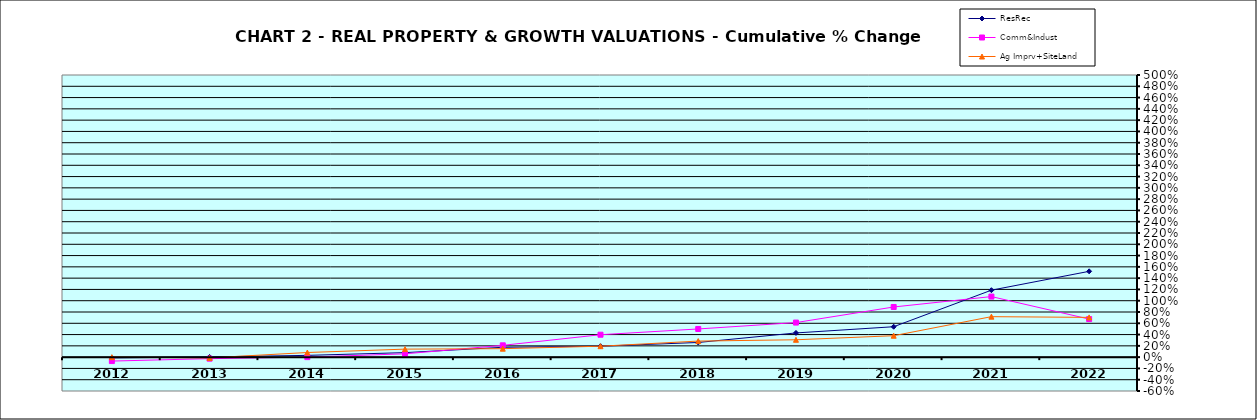
| Category | ResRec | Comm&Indust | Ag Imprv+SiteLand |
|---|---|---|---|
| 2012.0 | -0.013 | -0.07 | 0 |
| 2013.0 | 0.004 | -0.027 | -0.013 |
| 2014.0 | 0.031 | 0 | 0.082 |
| 2015.0 | 0.08 | 0.059 | 0.142 |
| 2016.0 | 0.175 | 0.209 | 0.15 |
| 2017.0 | 0.194 | 0.398 | 0.194 |
| 2018.0 | 0.26 | 0.499 | 0.285 |
| 2019.0 | 0.429 | 0.613 | 0.308 |
| 2020.0 | 0.539 | 0.889 | 0.38 |
| 2021.0 | 1.187 | 1.073 | 0.717 |
| 2022.0 | 1.521 | 0.675 | 0.705 |